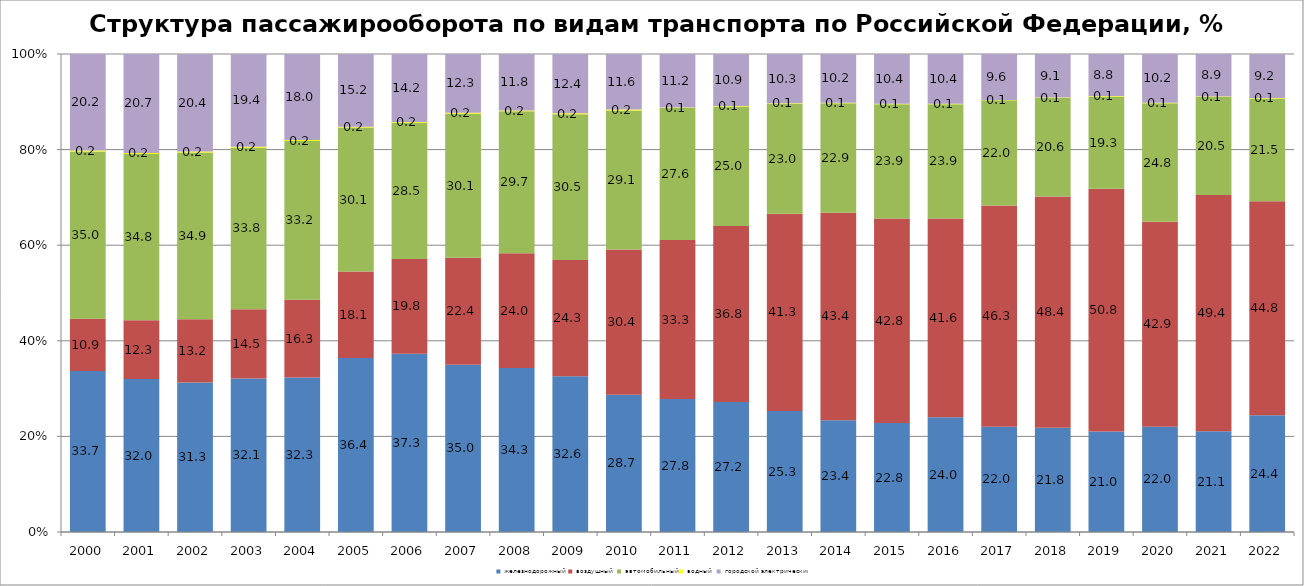
| Category | железнодорожный | воздушный | автомобильный | водный | городской электрический |
|---|---|---|---|---|---|
| 2000.0 | 33.7 | 10.9 | 35 | 0.2 | 20.2 |
| 2001.0 | 32 | 12.3 | 34.8 | 0.2 | 20.7 |
| 2002.0 | 31.3 | 13.2 | 34.9 | 0.2 | 20.4 |
| 2003.0 | 32.1 | 14.5 | 33.8 | 0.2 | 19.4 |
| 2004.0 | 32.3 | 16.3 | 33.2 | 0.2 | 18 |
| 2005.0 | 36.4 | 18.1 | 30.1 | 0.2 | 15.2 |
| 2006.0 | 37.3 | 19.8 | 28.5 | 0.2 | 14.2 |
| 2007.0 | 35 | 22.4 | 30.1 | 0.2 | 12.3 |
| 2008.0 | 34.3 | 24 | 29.7 | 0.2 | 11.8 |
| 2009.0 | 32.6 | 24.3 | 30.5 | 0.2 | 12.4 |
| 2010.0 | 28.7 | 30.4 | 29.1 | 0.2 | 11.6 |
| 2011.0 | 27.8 | 33.3 | 27.6 | 0.1 | 11.2 |
| 2012.0 | 27.2 | 36.8 | 25 | 0.1 | 10.9 |
| 2013.0 | 25.3 | 41.3 | 23 | 0.1 | 10.3 |
| 2014.0 | 23.4 | 43.4 | 22.9 | 0.1 | 10.2 |
| 2015.0 | 22.8 | 42.8 | 23.9 | 0.1 | 10.4 |
| 2016.0 | 24 | 41.6 | 23.9 | 0.1 | 10.4 |
| 2017.0 | 22 | 46.3 | 22 | 0.1 | 9.6 |
| 2018.0 | 21.8 | 48.4 | 20.6 | 0.1 | 9.1 |
| 2019.0 | 21 | 50.8 | 19.3 | 0.1 | 8.8 |
| 2020.0 | 22 | 42.9 | 24.8 | 0.1 | 10.2 |
| 2021.0 | 21.1 | 49.4 | 20.5 | 0.1 | 8.9 |
| 2022.0 | 24.4 | 44.8 | 21.5 | 0.1 | 9.2 |